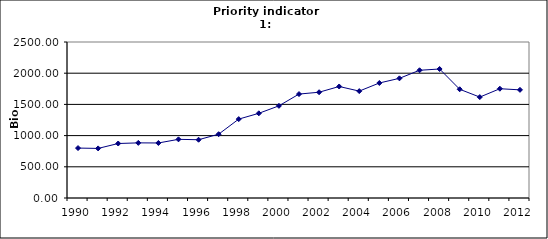
| Category | GDP, Bio Euro (EC95) |
|---|---|
| 1990 | 800.18 |
| 1991 | 794.696 |
| 1992 | 873.292 |
| 1993 | 883.601 |
| 1994 | 881.671 |
| 1995 | 940.197 |
| 1996 | 933.77 |
| 1997 | 1022.622 |
| 1998 | 1264.427 |
| 1999 | 1356.964 |
| 2000 | 1476.718 |
| 2001 | 1665.567 |
| 2002 | 1694.97 |
| 2003 | 1787.035 |
| 2004 | 1713.051 |
| 2005 | 1843.144 |
| 2006 | 1917.706 |
| 2007 | 2046.995 |
| 2008 | 2067.179 |
| 2009 | 1742.317 |
| 2010 | 1617.263 |
| 2011 | 1751.161 |
| 2012 | 1733.063 |